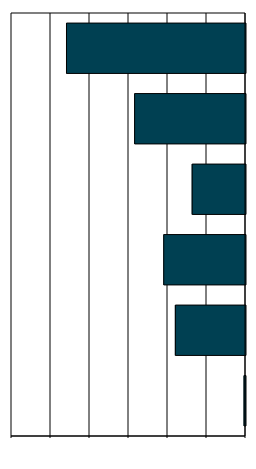
| Category | Series 0 |
|---|---|
| 0 | -0.075 |
| 1 | -3.598 |
| 2 | -4.192 |
| 3 | -2.735 |
| 4 | -5.685 |
| 5 | -9.18 |